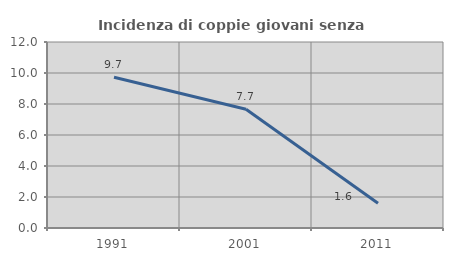
| Category | Incidenza di coppie giovani senza figli |
|---|---|
| 1991.0 | 9.722 |
| 2001.0 | 7.658 |
| 2011.0 | 1.596 |